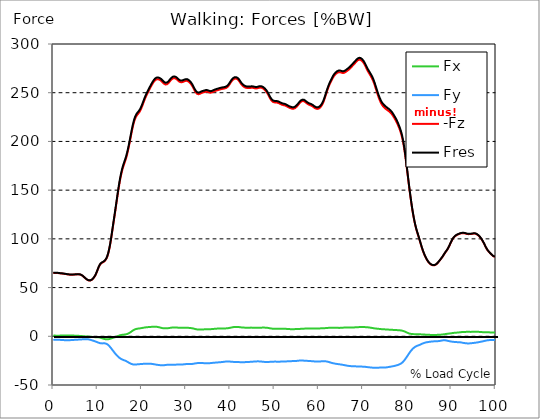
| Category |  Fx |  Fy |  -Fz |  Fres |
|---|---|---|---|---|
| 0.0 | 0.76 | -3.715 | 64.963 | 65.139 |
| 0.167348456675344 | 0.739 | -3.688 | 64.967 | 65.143 |
| 0.334696913350688 | 0.708 | -3.651 | 64.984 | 65.158 |
| 0.5020453700260321 | 0.669 | -3.611 | 65.007 | 65.179 |
| 0.669393826701376 | 0.629 | -3.578 | 65.024 | 65.193 |
| 0.83674228337672 | 0.603 | -3.56 | 65.014 | 65.181 |
| 1.0040907400520642 | 0.601 | -3.561 | 64.956 | 65.124 |
| 1.1621420602454444 | 0.618 | -3.583 | 64.855 | 65.022 |
| 1.3294905169207885 | 0.652 | -3.622 | 64.737 | 64.905 |
| 1.4968389735961325 | 0.694 | -3.671 | 64.634 | 64.803 |
| 1.6641874302714765 | 0.737 | -3.722 | 64.552 | 64.724 |
| 1.8315358869468206 | 0.779 | -3.774 | 64.482 | 64.657 |
| 1.9988843436221646 | 0.82 | -3.825 | 64.409 | 64.586 |
| 2.1662328002975086 | 0.855 | -3.876 | 64.316 | 64.495 |
| 2.333581256972853 | 0.882 | -3.926 | 64.202 | 64.384 |
| 2.5009297136481967 | 0.898 | -3.969 | 64.082 | 64.267 |
| 2.6682781703235405 | 0.9 | -4.001 | 63.967 | 64.154 |
| 2.8356266269988843 | 0.896 | -4.022 | 63.852 | 64.039 |
| 3.002975083674229 | 0.892 | -4.033 | 63.725 | 63.914 |
| 3.1703235403495724 | 0.886 | -4.037 | 63.592 | 63.781 |
| 3.337671997024917 | 0.88 | -4.033 | 63.463 | 63.651 |
| 3.4957233172182973 | 0.864 | -4.02 | 63.354 | 63.543 |
| 3.663071773893641 | 0.838 | -3.994 | 63.284 | 63.473 |
| 3.8304202305689854 | 0.804 | -3.957 | 63.255 | 63.442 |
| 3.997768687244329 | 0.769 | -3.91 | 63.254 | 63.439 |
| 4.165117143919673 | 0.739 | -3.857 | 63.264 | 63.448 |
| 4.332465600595017 | 0.716 | -3.804 | 63.272 | 63.453 |
| 4.499814057270361 | 0.698 | -3.752 | 63.279 | 63.458 |
| 4.667162513945706 | 0.681 | -3.701 | 63.301 | 63.477 |
| 4.834510970621049 | 0.664 | -3.65 | 63.352 | 63.526 |
| 5.001859427296393 | 0.644 | -3.6 | 63.429 | 63.602 |
| 5.169207883971737 | 0.622 | -3.553 | 63.512 | 63.683 |
| 5.336556340647081 | 0.592 | -3.508 | 63.569 | 63.737 |
| 5.503904797322425 | 0.548 | -3.464 | 63.591 | 63.757 |
| 5.671253253997769 | 0.491 | -3.416 | 63.582 | 63.745 |
| 5.82930457419115 | 0.419 | -3.363 | 63.539 | 63.696 |
| 5.996653030866494 | 0.345 | -3.306 | 63.433 | 63.586 |
| 6.164001487541838 | 0.276 | -3.254 | 63.227 | 63.374 |
| 6.331349944217181 | 0.215 | -3.208 | 62.892 | 63.036 |
| 6.498698400892526 | 0.161 | -3.165 | 62.428 | 62.567 |
| 6.66604685756787 | 0.107 | -3.118 | 61.852 | 61.987 |
| 6.833395314243213 | 0.051 | -3.068 | 61.193 | 61.325 |
| 7.000743770918558 | -0.011 | -3.018 | 60.495 | 60.624 |
| 7.168092227593902 | -0.079 | -2.974 | 59.798 | 59.925 |
| 7.335440684269246 | -0.15 | -2.947 | 59.145 | 59.27 |
| 7.50278914094459 | -0.218 | -2.945 | 58.556 | 58.681 |
| 7.6701375976199335 | -0.278 | -2.98 | 58.045 | 58.172 |
| 7.837486054295278 | -0.327 | -3.055 | 57.623 | 57.753 |
| 7.995537374488658 | -0.363 | -3.176 | 57.32 | 57.457 |
| 8.162885831164003 | -0.394 | -3.347 | 57.177 | 57.324 |
| 8.330234287839346 | -0.43 | -3.563 | 57.221 | 57.382 |
| 8.49758274451469 | -0.476 | -3.802 | 57.458 | 57.634 |
| 8.664931201190035 | -0.541 | -4.044 | 57.887 | 58.08 |
| 8.832279657865378 | -0.62 | -4.278 | 58.502 | 58.71 |
| 8.999628114540721 | -0.711 | -4.514 | 59.28 | 59.505 |
| 9.166976571216066 | -0.803 | -4.762 | 60.211 | 60.454 |
| 9.334325027891412 | -0.886 | -5.025 | 61.325 | 61.588 |
| 9.501673484566755 | -0.952 | -5.299 | 62.668 | 62.95 |
| 9.669021941242098 | -0.998 | -5.582 | 64.264 | 64.565 |
| 9.836370397917442 | -1.026 | -5.878 | 66.086 | 66.407 |
| 10.003718854592787 | -1.044 | -6.185 | 68.047 | 68.387 |
| 10.17106731126813 | -1.073 | -6.494 | 69.998 | 70.358 |
| 10.329118631461512 | -1.143 | -6.771 | 71.741 | 72.122 |
| 10.496467088136853 | -1.273 | -7.007 | 73.177 | 73.576 |
| 10.663815544812199 | -1.461 | -7.179 | 74.252 | 74.664 |
| 10.831164001487544 | -1.704 | -7.281 | 74.999 | 75.423 |
| 10.998512458162887 | -1.982 | -7.306 | 75.508 | 75.935 |
| 11.16586091483823 | -2.259 | -7.273 | 75.895 | 76.319 |
| 11.333209371513574 | -2.51 | -7.216 | 76.27 | 76.691 |
| 11.50055782818892 | -2.722 | -7.208 | 76.766 | 77.189 |
| 11.667906284864264 | -2.893 | -7.276 | 77.494 | 77.926 |
| 11.835254741539607 | -3.023 | -7.434 | 78.472 | 78.921 |
| 12.00260319821495 | -3.109 | -7.712 | 79.771 | 80.245 |
| 12.169951654890292 | -3.129 | -8.124 | 81.543 | 82.053 |
| 12.337300111565641 | -3.085 | -8.666 | 83.818 | 84.372 |
| 12.504648568240984 | -2.973 | -9.343 | 86.647 | 87.255 |
| 12.662699888434362 | -2.796 | -10.135 | 90.039 | 90.709 |
| 12.830048345109708 | -2.562 | -11.012 | 93.986 | 94.722 |
| 12.997396801785053 | -2.299 | -11.948 | 98.429 | 99.239 |
| 13.164745258460396 | -2.03 | -12.92 | 103.283 | 104.166 |
| 13.33209371513574 | -1.772 | -13.909 | 108.391 | 109.351 |
| 13.499442171811083 | -1.534 | -14.901 | 113.506 | 114.543 |
| 13.666790628486426 | -1.314 | -15.887 | 118.505 | 119.619 |
| 13.834139085161771 | -1.099 | -16.854 | 123.466 | 124.657 |
| 14.001487541837117 | -0.863 | -17.789 | 128.532 | 129.795 |
| 14.16883599851246 | -0.594 | -18.684 | 133.724 | 135.055 |
| 14.336184455187803 | -0.293 | -19.527 | 138.971 | 140.361 |
| 14.503532911863147 | 0.03 | -20.314 | 144.156 | 145.602 |
| 14.670881368538492 | 0.349 | -21.043 | 149.16 | 150.657 |
| 14.828932688731873 | 0.652 | -21.709 | 153.906 | 155.447 |
| 14.996281145407215 | 0.926 | -22.309 | 158.341 | 159.924 |
| 15.163629602082558 | 1.16 | -22.842 | 162.388 | 164.004 |
| 15.330978058757903 | 1.348 | -23.314 | 166.021 | 167.666 |
| 15.498326515433247 | 1.495 | -23.722 | 169.247 | 170.917 |
| 15.665674972108594 | 1.601 | -24.06 | 172.089 | 173.778 |
| 15.833023428783937 | 1.678 | -24.342 | 174.607 | 176.311 |
| 16.00037188545928 | 1.739 | -24.607 | 176.84 | 178.561 |
| 16.167720342134626 | 1.811 | -24.881 | 178.936 | 180.676 |
| 16.335068798809967 | 1.922 | -25.2 | 181.167 | 182.93 |
| 16.502417255485312 | 2.09 | -25.568 | 183.691 | 185.483 |
| 16.669765712160658 | 2.318 | -25.981 | 186.585 | 188.409 |
| 16.837114168836 | 2.614 | -26.429 | 189.798 | 191.659 |
| 17.004462625511344 | 2.98 | -26.882 | 193.27 | 195.166 |
| 17.16251394570472 | 3.403 | -27.322 | 196.942 | 198.871 |
| 17.32986240238007 | 3.869 | -27.737 | 200.768 | 202.727 |
| 17.497210859055414 | 4.37 | -28.111 | 204.696 | 206.679 |
| 17.664559315730756 | 4.905 | -28.431 | 208.598 | 210.602 |
| 17.8319077724061 | 5.445 | -28.678 | 212.325 | 214.339 |
| 17.999256229081443 | 5.963 | -28.848 | 215.751 | 217.77 |
| 18.166604685756788 | 6.442 | -28.942 | 218.778 | 220.794 |
| 18.333953142432133 | 6.861 | -28.974 | 221.354 | 223.363 |
| 18.501301599107478 | 7.2 | -28.962 | 223.453 | 225.45 |
| 18.668650055782823 | 7.461 | -28.926 | 225.132 | 227.118 |
| 18.835998512458165 | 7.655 | -28.868 | 226.448 | 228.42 |
| 19.00334696913351 | 7.796 | -28.793 | 227.488 | 229.447 |
| 19.170695425808855 | 7.902 | -28.722 | 228.404 | 230.349 |
| 19.338043882484197 | 7.996 | -28.654 | 229.351 | 231.282 |
| 19.496095202677576 | 8.096 | -28.586 | 230.484 | 232.401 |
| 19.66344365935292 | 8.207 | -28.526 | 231.834 | 233.735 |
| 19.830792116028263 | 8.334 | -28.468 | 233.438 | 235.324 |
| 19.998140572703612 | 8.471 | -28.406 | 235.257 | 237.126 |
| 20.165489029378953 | 8.615 | -28.349 | 237.228 | 239.079 |
| 20.3328374860543 | 8.76 | -28.302 | 239.274 | 241.11 |
| 20.500185942729644 | 8.899 | -28.264 | 241.309 | 243.13 |
| 20.667534399404985 | 9.027 | -28.23 | 243.257 | 245.064 |
| 20.83488285608033 | 9.141 | -28.197 | 245.089 | 246.884 |
| 21.002231312755672 | 9.235 | -28.163 | 246.802 | 248.584 |
| 21.16957976943102 | 9.311 | -28.131 | 248.4 | 250.168 |
| 21.336928226106362 | 9.375 | -28.111 | 249.941 | 251.7 |
| 21.504276682781704 | 9.437 | -28.109 | 251.461 | 253.211 |
| 21.67162513945705 | 9.498 | -28.129 | 252.945 | 254.688 |
| 21.82967645965043 | 9.56 | -28.168 | 254.391 | 256.132 |
| 21.997024916325774 | 9.619 | -28.215 | 255.811 | 257.549 |
| 22.16437337300112 | 9.674 | -28.28 | 257.196 | 258.935 |
| 22.33172182967646 | 9.722 | -28.367 | 258.536 | 260.278 |
| 22.499070286351806 | 9.761 | -28.48 | 259.811 | 261.558 |
| 22.666418743027148 | 9.793 | -28.614 | 260.974 | 262.729 |
| 22.833767199702496 | 9.816 | -28.76 | 261.982 | 263.747 |
| 23.00111565637784 | 9.822 | -28.903 | 262.789 | 264.565 |
| 23.168464113053183 | 9.801 | -29.033 | 263.353 | 265.138 |
| 23.335812569728528 | 9.741 | -29.158 | 263.692 | 265.486 |
| 23.50316102640387 | 9.64 | -29.283 | 263.84 | 265.642 |
| 23.670509483079215 | 9.504 | -29.396 | 263.82 | 265.63 |
| 23.83785793975456 | 9.339 | -29.494 | 263.651 | 265.466 |
| 23.995909259947936 | 9.149 | -29.58 | 263.352 | 265.172 |
| 24.163257716623285 | 8.945 | -29.657 | 262.934 | 264.759 |
| 24.330606173298627 | 8.734 | -29.722 | 262.394 | 264.223 |
| 24.49795462997397 | 8.544 | -29.763 | 261.705 | 263.538 |
| 24.665303086649313 | 8.381 | -29.774 | 260.898 | 262.732 |
| 24.83265154332466 | 8.254 | -29.748 | 260.073 | 261.908 |
| 25.0 | 8.17 | -29.689 | 259.361 | 261.19 |
| 25.167348456675345 | 8.129 | -29.603 | 258.813 | 260.636 |
| 25.334696913350694 | 8.124 | -29.5 | 258.483 | 260.296 |
| 25.502045370026035 | 8.143 | -29.395 | 258.411 | 260.213 |
| 25.669393826701377 | 8.188 | -29.295 | 258.612 | 260.402 |
| 25.836742283376722 | 8.258 | -29.214 | 259.081 | 260.862 |
| 26.004090740052067 | 8.351 | -29.157 | 259.794 | 261.566 |
| 26.17143919672741 | 8.466 | -29.122 | 260.688 | 262.453 |
| 26.329490516920792 | 8.596 | -29.106 | 261.663 | 263.424 |
| 26.49683897359613 | 8.726 | -29.097 | 262.597 | 264.355 |
| 26.66418743027148 | 8.848 | -29.096 | 263.429 | 265.186 |
| 26.831535886946828 | 8.956 | -29.1 | 264.12 | 265.875 |
| 26.998884343622166 | 9.045 | -29.107 | 264.63 | 266.387 |
| 27.166232800297514 | 9.101 | -29.112 | 264.921 | 266.678 |
| 27.333581256972852 | 9.122 | -29.112 | 264.984 | 266.741 |
| 27.5009297136482 | 9.109 | -29.108 | 264.835 | 266.593 |
| 27.668278170323543 | 9.071 | -29.099 | 264.504 | 266.263 |
| 27.835626626998888 | 9.012 | -29.086 | 264.012 | 265.771 |
| 28.002975083674233 | 8.933 | -29.068 | 263.36 | 265.118 |
| 28.170323540349575 | 8.843 | -29.045 | 262.598 | 264.357 |
| 28.33767199702492 | 8.759 | -29.02 | 261.859 | 263.618 |
| 28.50502045370026 | 8.699 | -28.999 | 261.291 | 263.049 |
| 28.663071773893645 | 8.669 | -28.982 | 260.921 | 262.68 |
| 28.830420230568986 | 8.664 | -28.964 | 260.743 | 262.503 |
| 28.99776868724433 | 8.671 | -28.942 | 260.735 | 262.493 |
| 29.165117143919673 | 8.689 | -28.911 | 260.875 | 262.63 |
| 29.33246560059502 | 8.719 | -28.868 | 261.146 | 262.896 |
| 29.499814057270367 | 8.762 | -28.797 | 261.5 | 263.242 |
| 29.66716251394571 | 8.794 | -28.701 | 261.845 | 263.575 |
| 29.834510970621054 | 8.803 | -28.603 | 262.116 | 263.834 |
| 30.00185942729639 | 8.789 | -28.515 | 262.247 | 263.955 |
| 30.169207883971744 | 8.759 | -28.443 | 262.23 | 263.928 |
| 30.33655634064708 | 8.717 | -28.393 | 262.047 | 263.739 |
| 30.50390479732243 | 8.665 | -28.373 | 261.658 | 263.347 |
| 30.671253253997772 | 8.607 | -28.383 | 261.098 | 262.791 |
| 30.829304574191156 | 8.547 | -28.409 | 260.406 | 262.103 |
| 30.996653030866494 | 8.483 | -28.433 | 259.599 | 261.302 |
| 31.164001487541842 | 8.402 | -28.439 | 258.642 | 260.347 |
| 31.331349944217187 | 8.289 | -28.402 | 257.473 | 259.179 |
| 31.498698400892525 | 8.144 | -28.328 | 256.134 | 257.835 |
| 31.666046857567874 | 7.969 | -28.214 | 254.675 | 256.368 |
| 31.833395314243212 | 7.771 | -28.069 | 253.167 | 254.848 |
| 32.00074377091856 | 7.56 | -27.911 | 251.766 | 253.433 |
| 32.1680922275939 | 7.355 | -27.764 | 250.563 | 252.215 |
| 32.33544068426925 | 7.172 | -27.643 | 249.599 | 251.24 |
| 32.50278914094459 | 7.019 | -27.548 | 248.898 | 250.527 |
| 32.670137597619934 | 6.912 | -27.475 | 248.511 | 250.133 |
| 32.83748605429528 | 6.852 | -27.428 | 248.443 | 250.059 |
| 33.004834510970625 | 6.834 | -27.409 | 248.632 | 250.243 |
| 33.162885831164004 | 6.853 | -27.411 | 248.987 | 250.597 |
| 33.33023428783935 | 6.893 | -27.433 | 249.401 | 251.011 |
| 33.497582744514695 | 6.937 | -27.469 | 249.76 | 251.372 |
| 33.664931201190036 | 6.983 | -27.506 | 250.042 | 251.657 |
| 33.83227965786538 | 7.029 | -27.535 | 250.253 | 251.869 |
| 33.99962811454073 | 7.078 | -27.561 | 250.439 | 252.058 |
| 34.16697657121607 | 7.128 | -27.597 | 250.667 | 252.289 |
| 34.33432502789141 | 7.176 | -27.637 | 250.919 | 252.543 |
| 34.50167348456676 | 7.214 | -27.682 | 251.102 | 252.731 |
| 34.6690219412421 | 7.242 | -27.726 | 251.139 | 252.773 |
| 34.83637039791744 | 7.261 | -27.752 | 251.011 | 252.648 |
| 35.00371885459279 | 7.27 | -27.743 | 250.742 | 252.38 |
| 35.17106731126814 | 7.275 | -27.695 | 250.392 | 252.028 |
| 35.338415767943474 | 7.283 | -27.621 | 250.091 | 251.72 |
| 35.49646708813686 | 7.303 | -27.532 | 249.962 | 251.583 |
| 35.6638155448122 | 7.341 | -27.443 | 250.027 | 251.638 |
| 35.831164001487544 | 7.393 | -27.356 | 250.26 | 251.863 |
| 35.998512458162885 | 7.46 | -27.278 | 250.598 | 252.192 |
| 36.165860914838234 | 7.535 | -27.199 | 250.964 | 252.548 |
| 36.333209371513576 | 7.61 | -27.129 | 251.324 | 252.902 |
| 36.50055782818892 | 7.681 | -27.073 | 251.654 | 253.227 |
| 36.667906284864266 | 7.747 | -27.022 | 251.939 | 253.506 |
| 36.83525474153961 | 7.808 | -26.97 | 252.185 | 253.746 |
| 37.002603198214956 | 7.861 | -26.905 | 252.411 | 253.967 |
| 37.1699516548903 | 7.905 | -26.83 | 252.636 | 254.183 |
| 37.337300111565646 | 7.939 | -26.749 | 252.873 | 254.412 |
| 37.50464856824098 | 7.971 | -26.68 | 253.122 | 254.653 |
| 37.66269988843437 | 8.004 | -26.624 | 253.353 | 254.878 |
| 37.83004834510971 | 8.04 | -26.566 | 253.555 | 255.073 |
| 37.99739680178505 | 8.072 | -26.501 | 253.729 | 255.241 |
| 38.16474525846039 | 8.095 | -26.424 | 253.89 | 255.395 |
| 38.33209371513574 | 8.104 | -26.336 | 254.041 | 255.536 |
| 38.49944217181109 | 8.099 | -26.229 | 254.171 | 255.653 |
| 38.666790628486424 | 8.089 | -26.12 | 254.297 | 255.768 |
| 38.83413908516178 | 8.085 | -26.018 | 254.472 | 255.931 |
| 39.001487541837115 | 8.101 | -25.94 | 254.751 | 256.203 |
| 39.16883599851246 | 8.143 | -25.895 | 255.159 | 256.605 |
| 39.336184455187805 | 8.216 | -25.878 | 255.725 | 257.169 |
| 39.503532911863154 | 8.32 | -25.883 | 256.481 | 257.924 |
| 39.670881368538495 | 8.447 | -25.905 | 257.43 | 258.874 |
| 39.83822982521384 | 8.589 | -25.945 | 258.541 | 259.987 |
| 39.996281145407224 | 8.748 | -26 | 259.734 | 261.186 |
| 40.163629602082565 | 8.913 | -26.064 | 260.913 | 262.369 |
| 40.33097805875791 | 9.081 | -26.134 | 261.972 | 263.435 |
| 40.498326515433256 | 9.241 | -26.203 | 262.86 | 264.33 |
| 40.6656749721086 | 9.38 | -26.265 | 263.565 | 265.042 |
| 40.83302342878393 | 9.494 | -26.315 | 264.091 | 265.573 |
| 41.00037188545929 | 9.578 | -26.355 | 264.432 | 265.92 |
| 41.16772034213463 | 9.631 | -26.389 | 264.566 | 266.059 |
| 41.33506879880997 | 9.65 | -26.419 | 264.483 | 265.979 |
| 41.50241725548531 | 9.632 | -26.445 | 264.186 | 265.685 |
| 41.66976571216066 | 9.584 | -26.469 | 263.672 | 265.176 |
| 41.837114168836 | 9.514 | -26.492 | 262.95 | 264.457 |
| 42.004462625511344 | 9.426 | -26.514 | 262.03 | 263.542 |
| 42.17181108218669 | 9.325 | -26.533 | 260.933 | 262.45 |
| 42.32986240238007 | 9.221 | -26.55 | 259.744 | 261.265 |
| 42.497210859055414 | 9.124 | -26.562 | 258.648 | 260.174 |
| 42.66455931573076 | 9.042 | -26.574 | 257.727 | 259.257 |
| 42.831907772406105 | 8.978 | -26.58 | 256.975 | 258.507 |
| 42.999256229081446 | 8.93 | -26.574 | 256.355 | 257.888 |
| 43.16660468575679 | 8.891 | -26.554 | 255.828 | 257.362 |
| 43.33395314243214 | 8.862 | -26.526 | 255.415 | 256.946 |
| 43.50130159910748 | 8.843 | -26.493 | 255.118 | 256.646 |
| 43.66865005578282 | 8.835 | -26.455 | 254.929 | 256.453 |
| 43.83599851245817 | 8.839 | -26.413 | 254.831 | 256.352 |
| 44.00334696913351 | 8.845 | -26.369 | 254.782 | 256.3 |
| 44.17069542580886 | 8.854 | -26.328 | 254.771 | 256.285 |
| 44.3380438824842 | 8.87 | -26.286 | 254.81 | 256.318 |
| 44.49609520267758 | 8.883 | -26.243 | 254.892 | 256.396 |
| 44.66344365935292 | 8.891 | -26.193 | 254.999 | 256.499 |
| 44.83079211602827 | 8.89 | -26.136 | 255.075 | 256.567 |
| 44.99814057270361 | 8.878 | -26.076 | 255.055 | 256.542 |
| 45.16548902937895 | 8.86 | -26.017 | 254.956 | 256.437 |
| 45.332837486054295 | 8.839 | -25.958 | 254.791 | 256.266 |
| 45.500185942729644 | 8.817 | -25.901 | 254.598 | 256.068 |
| 45.66753439940499 | 8.797 | -25.848 | 254.447 | 255.91 |
| 45.83488285608033 | 8.781 | -25.799 | 254.39 | 255.849 |
| 46.00223131275568 | 8.768 | -25.757 | 254.439 | 255.894 |
| 46.16957976943102 | 8.759 | -25.729 | 254.592 | 256.042 |
| 46.336928226106366 | 8.757 | -25.725 | 254.829 | 256.278 |
| 46.50427668278171 | 8.765 | -25.751 | 255.07 | 256.522 |
| 46.671625139457056 | 8.787 | -25.798 | 255.238 | 256.694 |
| 46.829676459650436 | 8.821 | -25.863 | 255.283 | 256.747 |
| 46.99702491632577 | 8.859 | -25.937 | 255.196 | 256.669 |
| 47.16437337300112 | 8.895 | -26.016 | 254.97 | 256.453 |
| 47.33172182967646 | 8.919 | -26.098 | 254.602 | 256.096 |
| 47.49907028635181 | 8.925 | -26.177 | 254.103 | 255.609 |
| 47.66641874302716 | 8.913 | -26.252 | 253.489 | 255.005 |
| 47.83376719970249 | 8.893 | -26.324 | 252.775 | 254.304 |
| 48.001115656377834 | 8.857 | -26.383 | 251.94 | 253.478 |
| 48.16846411305319 | 8.802 | -26.418 | 250.966 | 252.512 |
| 48.33581256972853 | 8.726 | -26.424 | 249.848 | 251.399 |
| 48.50316102640387 | 8.62 | -26.403 | 248.586 | 250.14 |
| 48.67050948307921 | 8.491 | -26.357 | 247.202 | 248.755 |
| 48.837857939754564 | 8.343 | -26.285 | 245.714 | 247.263 |
| 49.005206396429905 | 8.191 | -26.206 | 244.237 | 245.782 |
| 49.163257716623285 | 8.051 | -26.141 | 242.942 | 244.483 |
| 49.33060617329863 | 7.928 | -26.094 | 241.884 | 243.423 |
| 49.49795462997397 | 7.832 | -26.063 | 241.088 | 242.626 |
| 49.66530308664932 | 7.766 | -26.039 | 240.535 | 242.072 |
| 49.832651543324666 | 7.731 | -26.019 | 240.216 | 241.753 |
| 50.0 | 7.717 | -26.008 | 240.078 | 241.613 |
| 50.16734845667534 | 7.721 | -26.006 | 240.034 | 241.57 |
| 50.33469691335069 | 7.734 | -26.011 | 239.999 | 241.537 |
| 50.50204537002604 | 7.752 | -26.024 | 239.911 | 241.454 |
| 50.66939382670139 | 7.766 | -26.041 | 239.766 | 241.311 |
| 50.836742283376715 | 7.771 | -26.051 | 239.546 | 241.094 |
| 51.00409074005207 | 7.757 | -26.048 | 239.225 | 240.775 |
| 51.17143919672741 | 7.735 | -26.032 | 238.818 | 240.367 |
| 51.32949051692079 | 7.715 | -26.009 | 238.392 | 239.941 |
| 51.496838973596134 | 7.711 | -25.984 | 238.023 | 239.572 |
| 51.66418743027148 | 7.717 | -25.962 | 237.716 | 239.264 |
| 51.831535886946824 | 7.731 | -25.943 | 237.469 | 239.018 |
| 51.99888434362217 | 7.734 | -25.918 | 237.276 | 238.825 |
| 52.16623280029752 | 7.713 | -25.871 | 237.14 | 238.684 |
| 52.33358125697285 | 7.678 | -25.82 | 236.98 | 238.517 |
| 52.5009297136482 | 7.645 | -25.789 | 236.694 | 238.23 |
| 52.668278170323546 | 7.611 | -25.77 | 236.3 | 237.836 |
| 52.835626626998895 | 7.569 | -25.75 | 235.858 | 237.393 |
| 53.00297508367424 | 7.519 | -25.72 | 235.414 | 236.946 |
| 53.17032354034958 | 7.463 | -25.675 | 235.004 | 236.533 |
| 53.33767199702492 | 7.404 | -25.623 | 234.633 | 236.157 |
| 53.50502045370027 | 7.345 | -25.573 | 234.307 | 235.827 |
| 53.663071773893655 | 7.292 | -25.53 | 234.037 | 235.553 |
| 53.83042023056899 | 7.253 | -25.499 | 233.808 | 235.323 |
| 53.99776868724433 | 7.238 | -25.486 | 233.614 | 235.128 |
| 54.16511714391967 | 7.247 | -25.48 | 233.512 | 235.026 |
| 54.33246560059503 | 7.274 | -25.47 | 233.589 | 235.102 |
| 54.49981405727037 | 7.321 | -25.445 | 233.853 | 235.364 |
| 54.667162513945705 | 7.38 | -25.405 | 234.288 | 235.795 |
| 54.834510970621054 | 7.442 | -25.35 | 234.866 | 236.368 |
| 55.0018594272964 | 7.501 | -25.278 | 235.578 | 237.07 |
| 55.169207883971744 | 7.547 | -25.189 | 236.414 | 237.896 |
| 55.336556340647086 | 7.567 | -25.091 | 237.353 | 238.822 |
| 55.50390479732243 | 7.571 | -24.999 | 238.33 | 239.786 |
| 55.671253253997776 | 7.578 | -24.926 | 239.27 | 240.715 |
| 55.83860171067312 | 7.596 | -24.882 | 240.099 | 241.536 |
| 55.9966530308665 | 7.628 | -24.87 | 240.762 | 242.197 |
| 56.16400148754184 | 7.662 | -24.878 | 241.229 | 242.664 |
| 56.33134994421718 | 7.704 | -24.906 | 241.466 | 242.903 |
| 56.498698400892536 | 7.757 | -24.952 | 241.478 | 242.921 |
| 56.66604685756788 | 7.82 | -25.004 | 241.276 | 242.727 |
| 56.83339531424321 | 7.886 | -25.052 | 240.881 | 242.34 |
| 57.00074377091856 | 7.945 | -25.101 | 240.316 | 241.783 |
| 57.16809222759391 | 7.987 | -25.152 | 239.647 | 241.125 |
| 57.33544068426925 | 8.022 | -25.207 | 238.981 | 240.468 |
| 57.5027891409446 | 8.06 | -25.261 | 238.416 | 239.912 |
| 57.670137597619934 | 8.086 | -25.306 | 237.977 | 239.48 |
| 57.83748605429528 | 8.102 | -25.346 | 237.627 | 239.136 |
| 58.004834510970625 | 8.106 | -25.388 | 237.325 | 238.841 |
| 58.16288583116401 | 8.103 | -25.442 | 237.042 | 238.563 |
| 58.330234287839346 | 8.094 | -25.506 | 236.729 | 238.259 |
| 58.497582744514695 | 8.088 | -25.575 | 236.327 | 237.866 |
| 58.66493120119004 | 8.078 | -25.645 | 235.826 | 237.374 |
| 58.832279657865385 | 8.063 | -25.712 | 235.248 | 236.807 |
| 58.999628114540734 | 8.044 | -25.772 | 234.653 | 236.219 |
| 59.16697657121607 | 8.034 | -25.822 | 234.133 | 235.707 |
| 59.33432502789142 | 8.035 | -25.86 | 233.727 | 235.309 |
| 59.50167348456676 | 8.043 | -25.881 | 233.465 | 235.05 |
| 59.66902194124211 | 8.05 | -25.894 | 233.367 | 234.955 |
| 59.83637039791745 | 8.058 | -25.894 | 233.442 | 235.028 |
| 60.00371885459278 | 8.071 | -25.88 | 233.705 | 235.29 |
| 60.17106731126813 | 8.09 | -25.852 | 234.168 | 235.748 |
| 60.33841576794349 | 8.113 | -25.809 | 234.829 | 236.401 |
| 60.49646708813685 | 8.141 | -25.753 | 235.706 | 237.268 |
| 60.6638155448122 | 8.172 | -25.691 | 236.816 | 238.366 |
| 60.831164001487544 | 8.209 | -25.637 | 238.165 | 239.703 |
| 60.99851245816289 | 8.252 | -25.6 | 239.781 | 241.306 |
| 61.16586091483824 | 8.295 | -25.587 | 241.668 | 243.181 |
| 61.333209371513576 | 8.334 | -25.604 | 243.806 | 245.311 |
| 61.50055782818892 | 8.378 | -25.659 | 246.147 | 247.644 |
| 61.667906284864266 | 8.439 | -25.755 | 248.601 | 250.094 |
| 61.835254741539615 | 8.51 | -25.888 | 250.981 | 252.476 |
| 62.002603198214956 | 8.58 | -26.057 | 253.176 | 254.678 |
| 62.16995165489029 | 8.636 | -26.246 | 255.276 | 256.789 |
| 62.33730011156564 | 8.678 | -26.458 | 257.227 | 258.75 |
| 62.504648568240995 | 8.705 | -26.696 | 258.965 | 260.504 |
| 62.67199702491633 | 8.721 | -26.942 | 260.548 | 262.104 |
| 62.83004834510971 | 8.725 | -27.18 | 262.064 | 263.635 |
| 62.99739680178505 | 8.712 | -27.394 | 263.596 | 265.18 |
| 63.1647452584604 | 8.705 | -27.581 | 265.066 | 266.659 |
| 63.33209371513575 | 8.707 | -27.753 | 266.348 | 267.951 |
| 63.4994421718111 | 8.708 | -27.91 | 267.448 | 269.061 |
| 63.666790628486424 | 8.702 | -28.054 | 268.387 | 270.009 |
| 63.83413908516177 | 8.691 | -28.187 | 269.188 | 270.82 |
| 64.00148754183712 | 8.673 | -28.307 | 269.859 | 271.499 |
| 64.16883599851248 | 8.656 | -28.416 | 270.4 | 272.048 |
| 64.3361844551878 | 8.64 | -28.519 | 270.806 | 272.462 |
| 64.50353291186315 | 8.628 | -28.62 | 271.056 | 272.721 |
| 64.6708813685385 | 8.623 | -28.727 | 271.136 | 272.812 |
| 64.83822982521384 | 8.633 | -28.84 | 271.053 | 272.743 |
| 65.00557828188919 | 8.668 | -28.957 | 270.83 | 272.537 |
| 65.16362960208257 | 8.731 | -29.086 | 270.541 | 272.267 |
| 65.3309780587579 | 8.801 | -29.221 | 270.308 | 272.054 |
| 65.49832651543326 | 8.861 | -29.357 | 270.23 | 271.998 |
| 65.6656749721086 | 8.911 | -29.499 | 270.331 | 272.116 |
| 65.83302342878395 | 8.95 | -29.647 | 270.603 | 272.406 |
| 66.00037188545929 | 8.981 | -29.797 | 271.016 | 272.834 |
| 66.16772034213463 | 9.007 | -29.943 | 271.559 | 273.392 |
| 66.33506879880998 | 9.025 | -30.082 | 272.157 | 274.002 |
| 66.50241725548531 | 9.036 | -30.215 | 272.73 | 274.586 |
| 66.66976571216065 | 9.05 | -30.335 | 273.278 | 275.145 |
| 66.83711416883601 | 9.061 | -30.441 | 273.869 | 275.743 |
| 67.00446262551135 | 9.058 | -30.527 | 274.546 | 276.425 |
| 67.1718110821867 | 9.049 | -30.602 | 275.301 | 277.183 |
| 67.32986240238007 | 9.047 | -30.667 | 276.103 | 277.988 |
| 67.49721085905541 | 9.061 | -30.724 | 276.927 | 278.813 |
| 67.66455931573076 | 9.078 | -30.752 | 277.754 | 279.638 |
| 67.83190777240611 | 9.097 | -30.772 | 278.572 | 280.453 |
| 67.99925622908145 | 9.119 | -30.799 | 279.368 | 281.249 |
| 68.16660468575678 | 9.146 | -30.829 | 280.181 | 282.06 |
| 68.33395314243214 | 9.188 | -30.864 | 281.049 | 282.929 |
| 68.50130159910749 | 9.238 | -30.898 | 281.91 | 283.791 |
| 68.66865005578282 | 9.291 | -30.927 | 282.687 | 284.567 |
| 68.83599851245816 | 9.342 | -30.954 | 283.315 | 285.197 |
| 69.00334696913352 | 9.386 | -30.975 | 283.74 | 285.623 |
| 69.17069542580886 | 9.42 | -30.994 | 283.935 | 285.82 |
| 69.3380438824842 | 9.455 | -31.017 | 283.897 | 285.787 |
| 69.50539233915956 | 9.479 | -31.047 | 283.625 | 285.522 |
| 69.66344365935292 | 9.493 | -31.089 | 283.125 | 285.032 |
| 69.83079211602826 | 9.49 | -31.134 | 282.445 | 284.362 |
| 69.99814057270362 | 9.478 | -31.18 | 281.58 | 283.509 |
| 70.16548902937896 | 9.459 | -31.23 | 280.502 | 282.445 |
| 70.33283748605429 | 9.438 | -31.283 | 279.235 | 281.194 |
| 70.50018594272964 | 9.409 | -31.346 | 277.811 | 279.785 |
| 70.667534399405 | 9.372 | -31.426 | 276.249 | 278.245 |
| 70.83488285608033 | 9.329 | -31.528 | 274.612 | 276.629 |
| 71.00223131275568 | 9.274 | -31.633 | 273.065 | 275.104 |
| 71.16957976943102 | 9.193 | -31.723 | 271.664 | 273.721 |
| 71.33692822610637 | 9.083 | -31.802 | 270.408 | 272.479 |
| 71.50427668278171 | 8.967 | -31.889 | 269.163 | 271.251 |
| 71.67162513945706 | 8.851 | -31.984 | 267.875 | 269.98 |
| 71.8389735961324 | 8.734 | -32.075 | 266.534 | 268.658 |
| 71.99702491632577 | 8.614 | -32.145 | 265.128 | 267.27 |
| 72.16437337300113 | 8.475 | -32.191 | 263.599 | 265.755 |
| 72.33172182967647 | 8.33 | -32.212 | 261.845 | 264.016 |
| 72.49907028635181 | 8.193 | -32.216 | 259.855 | 262.04 |
| 72.66641874302715 | 8.073 | -32.208 | 257.642 | 259.843 |
| 72.8337671997025 | 7.982 | -32.208 | 255.281 | 257.5 |
| 73.00111565637783 | 7.905 | -32.207 | 252.861 | 255.1 |
| 73.16846411305319 | 7.827 | -32.197 | 250.433 | 252.69 |
| 73.33581256972853 | 7.747 | -32.184 | 248.065 | 250.341 |
| 73.50316102640387 | 7.664 | -32.174 | 245.838 | 248.131 |
| 73.67050948307921 | 7.577 | -32.17 | 243.785 | 246.094 |
| 73.83785793975457 | 7.486 | -32.166 | 241.907 | 244.232 |
| 74.00520639642991 | 7.399 | -32.166 | 240.208 | 242.546 |
| 74.16325771662328 | 7.327 | -32.166 | 238.711 | 241.064 |
| 74.33060617329863 | 7.27 | -32.168 | 237.446 | 239.809 |
| 74.49795462997398 | 7.222 | -32.165 | 236.411 | 238.782 |
| 74.66530308664932 | 7.176 | -32.147 | 235.54 | 237.917 |
| 74.83265154332466 | 7.132 | -32.11 | 234.77 | 237.147 |
| 75.00000000000001 | 7.09 | -32.052 | 234.057 | 236.431 |
| 75.16734845667534 | 7.054 | -31.984 | 233.376 | 235.746 |
| 75.3346969133507 | 7.012 | -31.9 | 232.748 | 235.111 |
| 75.50204537002605 | 6.952 | -31.789 | 232.206 | 234.558 |
| 75.66939382670138 | 6.885 | -31.655 | 231.69 | 234.028 |
| 75.83674228337672 | 6.832 | -31.518 | 231.135 | 233.458 |
| 76.00409074005208 | 6.789 | -31.387 | 230.511 | 232.821 |
| 76.17143919672742 | 6.752 | -31.266 | 229.85 | 232.15 |
| 76.33878765340276 | 6.71 | -31.142 | 229.089 | 231.377 |
| 76.49683897359614 | 6.659 | -31.002 | 228.185 | 230.46 |
| 76.66418743027148 | 6.605 | -30.852 | 227.146 | 229.411 |
| 76.83153588694682 | 6.56 | -30.701 | 225.975 | 228.228 |
| 76.99888434362218 | 6.519 | -30.537 | 224.755 | 226.997 |
| 77.16623280029752 | 6.478 | -30.361 | 223.501 | 225.732 |
| 77.33358125697285 | 6.435 | -30.172 | 222.185 | 224.4 |
| 77.5009297136482 | 6.391 | -29.969 | 220.783 | 222.983 |
| 77.66827817032356 | 6.345 | -29.753 | 219.269 | 221.45 |
| 77.83562662699889 | 6.298 | -29.518 | 217.641 | 219.804 |
| 78.00297508367423 | 6.254 | -29.253 | 215.888 | 218.03 |
| 78.17032354034959 | 6.203 | -28.957 | 214.006 | 216.125 |
| 78.33767199702493 | 6.137 | -28.626 | 211.979 | 214.07 |
| 78.50502045370027 | 6.044 | -28.249 | 209.771 | 211.829 |
| 78.67236891037561 | 5.924 | -27.802 | 207.298 | 209.315 |
| 78.83042023056899 | 5.774 | -27.245 | 204.432 | 206.399 |
| 78.99776868724433 | 5.59 | -26.54 | 201.024 | 202.924 |
| 79.16511714391969 | 5.364 | -25.707 | 197.004 | 198.828 |
| 79.33246560059503 | 5.098 | -24.781 | 192.419 | 194.157 |
| 79.49981405727036 | 4.798 | -23.784 | 187.332 | 188.98 |
| 79.66716251394571 | 4.46 | -22.732 | 181.781 | 183.334 |
| 79.83451097062107 | 4.094 | -21.637 | 175.857 | 177.312 |
| 80.00185942729641 | 3.714 | -20.5 | 169.645 | 170.998 |
| 80.16920788397174 | 3.353 | -19.353 | 163.355 | 164.607 |
| 80.33655634064709 | 3.042 | -18.222 | 157.156 | 158.309 |
| 80.50390479732243 | 2.797 | -17.129 | 151.191 | 152.252 |
| 80.67125325399778 | 2.615 | -16.062 | 145.446 | 146.418 |
| 80.83860171067312 | 2.483 | -15.047 | 139.937 | 140.827 |
| 80.99665303086651 | 2.384 | -14.102 | 134.689 | 135.504 |
| 81.16400148754184 | 2.305 | -13.253 | 129.786 | 130.536 |
| 81.3313499442172 | 2.238 | -12.499 | 125.262 | 125.956 |
| 81.49869840089255 | 2.187 | -11.828 | 121.105 | 121.75 |
| 81.66604685756786 | 2.153 | -11.239 | 117.316 | 117.92 |
| 81.83339531424322 | 2.132 | -10.726 | 113.9 | 114.469 |
| 82.00074377091858 | 2.123 | -10.296 | 110.863 | 111.404 |
| 82.16809222759392 | 2.126 | -9.947 | 108.167 | 108.686 |
| 82.33544068426926 | 2.136 | -9.659 | 105.698 | 106.201 |
| 82.50278914094459 | 2.137 | -9.396 | 103.312 | 103.803 |
| 82.67013759761994 | 2.111 | -9.118 | 100.863 | 101.339 |
| 82.83748605429528 | 2.063 | -8.809 | 98.328 | 98.786 |
| 83.00483451097062 | 2.004 | -8.466 | 95.747 | 96.185 |
| 83.17218296764597 | 1.942 | -8.107 | 93.187 | 93.604 |
| 83.33023428783935 | 1.884 | -7.748 | 90.732 | 91.129 |
| 83.4975827445147 | 1.835 | -7.401 | 88.443 | 88.821 |
| 83.66493120119004 | 1.799 | -7.086 | 86.352 | 86.715 |
| 83.83227965786537 | 1.766 | -6.813 | 84.442 | 84.79 |
| 83.99962811454073 | 1.73 | -6.58 | 82.668 | 83.004 |
| 84.16697657121607 | 1.693 | -6.39 | 81.026 | 81.351 |
| 84.33432502789142 | 1.647 | -6.228 | 79.535 | 79.852 |
| 84.50167348456677 | 1.591 | -6.082 | 78.204 | 78.513 |
| 84.6690219412421 | 1.538 | -5.946 | 77.03 | 77.332 |
| 84.83637039791745 | 1.494 | -5.819 | 75.998 | 76.291 |
| 85.0037188545928 | 1.465 | -5.706 | 75.105 | 75.392 |
| 85.17106731126813 | 1.444 | -5.598 | 74.358 | 74.638 |
| 85.33841576794349 | 1.423 | -5.491 | 73.77 | 74.042 |
| 85.50576422461883 | 1.403 | -5.395 | 73.329 | 73.594 |
| 85.66381554481221 | 1.388 | -5.315 | 73.018 | 73.28 |
| 85.83116400148755 | 1.38 | -5.255 | 72.835 | 73.094 |
| 85.99851245816289 | 1.376 | -5.209 | 72.782 | 73.037 |
| 86.16586091483823 | 1.376 | -5.172 | 72.874 | 73.127 |
| 86.33320937151358 | 1.387 | -5.141 | 73.131 | 73.384 |
| 86.50055782818893 | 1.408 | -5.109 | 73.566 | 73.818 |
| 86.66790628486427 | 1.435 | -5.076 | 74.172 | 74.424 |
| 86.83525474153961 | 1.46 | -5.038 | 74.923 | 75.177 |
| 87.00260319821496 | 1.488 | -4.987 | 75.776 | 76.029 |
| 87.16995165489031 | 1.521 | -4.911 | 76.687 | 76.939 |
| 87.33730011156564 | 1.562 | -4.804 | 77.631 | 77.88 |
| 87.504648568241 | 1.619 | -4.671 | 78.595 | 78.841 |
| 87.67199702491634 | 1.691 | -4.52 | 79.579 | 79.823 |
| 87.83004834510972 | 1.775 | -4.363 | 80.598 | 80.841 |
| 87.99739680178506 | 1.866 | -4.22 | 81.673 | 81.916 |
| 88.1647452584604 | 1.959 | -4.114 | 82.831 | 83.076 |
| 88.33209371513574 | 2.053 | -4.061 | 84.044 | 84.293 |
| 88.49944217181108 | 2.153 | -4.074 | 85.229 | 85.481 |
| 88.66679062848644 | 2.263 | -4.157 | 86.316 | 86.571 |
| 88.83413908516178 | 2.397 | -4.306 | 87.332 | 87.591 |
| 89.00148754183712 | 2.523 | -4.479 | 88.403 | 88.666 |
| 89.16883599851246 | 2.626 | -4.65 | 89.623 | 89.888 |
| 89.33618445518782 | 2.721 | -4.822 | 91.012 | 91.276 |
| 89.50353291186315 | 2.812 | -4.986 | 92.55 | 92.816 |
| 89.6708813685385 | 2.904 | -5.142 | 94.189 | 94.457 |
| 89.83822982521386 | 3.007 | -5.293 | 95.82 | 96.091 |
| 90.00557828188919 | 3.117 | -5.43 | 97.389 | 97.664 |
| 90.16362960208257 | 3.231 | -5.551 | 98.85 | 99.129 |
| 90.3309780587579 | 3.352 | -5.65 | 100.139 | 100.422 |
| 90.49832651543326 | 3.467 | -5.73 | 101.239 | 101.526 |
| 90.66567497210859 | 3.566 | -5.795 | 102.119 | 102.408 |
| 90.83302342878395 | 3.64 | -5.86 | 102.809 | 103.099 |
| 91.00037188545929 | 3.695 | -5.927 | 103.358 | 103.65 |
| 91.16772034213463 | 3.741 | -5.982 | 103.813 | 104.105 |
| 91.33506879880998 | 3.788 | -6.018 | 104.208 | 104.501 |
| 91.50241725548533 | 3.85 | -6.028 | 104.568 | 104.862 |
| 91.66976571216065 | 3.927 | -6.035 | 104.898 | 105.193 |
| 91.83711416883601 | 4.019 | -6.076 | 105.216 | 105.516 |
| 92.00446262551137 | 4.122 | -6.165 | 105.499 | 105.807 |
| 92.1718110821867 | 4.22 | -6.294 | 105.705 | 106.023 |
| 92.33915953886203 | 4.308 | -6.448 | 105.824 | 106.152 |
| 92.49721085905541 | 4.379 | -6.608 | 105.87 | 106.209 |
| 92.66455931573077 | 4.431 | -6.752 | 105.873 | 106.22 |
| 92.83190777240611 | 4.466 | -6.873 | 105.812 | 106.168 |
| 92.99925622908145 | 4.492 | -6.985 | 105.684 | 106.048 |
| 93.1666046857568 | 4.512 | -7.094 | 105.494 | 105.865 |
| 93.33395314243214 | 4.529 | -7.193 | 105.268 | 105.647 |
| 93.50130159910749 | 4.546 | -7.274 | 105.045 | 105.43 |
| 93.66865005578283 | 4.566 | -7.325 | 104.868 | 105.258 |
| 93.83599851245818 | 4.572 | -7.337 | 104.809 | 105.2 |
| 94.00334696913353 | 4.555 | -7.307 | 104.876 | 105.263 |
| 94.17069542580886 | 4.532 | -7.251 | 104.96 | 105.34 |
| 94.3380438824842 | 4.516 | -7.178 | 104.982 | 105.355 |
| 94.50539233915954 | 4.519 | -7.099 | 105.002 | 105.37 |
| 94.66344365935292 | 4.533 | -7.016 | 105.076 | 105.438 |
| 94.83079211602828 | 4.557 | -6.932 | 105.223 | 105.58 |
| 94.99814057270362 | 4.585 | -6.845 | 105.397 | 105.75 |
| 95.16548902937897 | 4.595 | -6.745 | 105.528 | 105.874 |
| 95.33283748605432 | 4.598 | -6.643 | 105.465 | 105.804 |
| 95.50018594272963 | 4.601 | -6.546 | 105.209 | 105.543 |
| 95.66753439940499 | 4.603 | -6.448 | 104.83 | 105.159 |
| 95.83488285608034 | 4.593 | -6.331 | 104.38 | 104.701 |
| 96.00223131275567 | 4.571 | -6.201 | 103.847 | 104.162 |
| 96.16957976943102 | 4.54 | -6.058 | 103.217 | 103.521 |
| 96.33692822610638 | 4.499 | -5.904 | 102.468 | 102.763 |
| 96.50427668278171 | 4.449 | -5.746 | 101.601 | 101.888 |
| 96.67162513945706 | 4.39 | -5.589 | 100.603 | 100.88 |
| 96.8389735961324 | 4.326 | -5.433 | 99.477 | 99.744 |
| 96.99702491632577 | 4.265 | -5.273 | 98.252 | 98.509 |
| 97.16437337300111 | 4.213 | -5.11 | 96.932 | 97.18 |
| 97.33172182967647 | 4.168 | -4.942 | 95.51 | 95.75 |
| 97.49907028635181 | 4.139 | -4.757 | 93.992 | 94.224 |
| 97.66641874302715 | 4.124 | -4.564 | 92.419 | 92.643 |
| 97.8337671997025 | 4.115 | -4.391 | 90.937 | 91.156 |
| 98.00111565637785 | 4.104 | -4.247 | 89.613 | 89.827 |
| 98.16846411305319 | 4.088 | -4.126 | 88.435 | 88.645 |
| 98.33581256972855 | 4.064 | -4.028 | 87.416 | 87.622 |
| 98.50316102640389 | 4.038 | -3.951 | 86.517 | 86.721 |
| 98.67050948307921 | 4.008 | -3.893 | 85.692 | 85.894 |
| 98.83785793975456 | 3.978 | -3.848 | 84.932 | 85.131 |
| 99.0052063964299 | 3.957 | -3.816 | 84.194 | 84.393 |
| 99.17255485310525 | 3.948 | -3.799 | 83.448 | 83.648 |
| 99.33060617329863 | 3.947 | -3.793 | 82.738 | 82.94 |
| 99.49795462997399 | 3.932 | -3.777 | 82.16 | 82.361 |
| 99.66530308664933 | 3.898 | -3.748 | 81.763 | 81.961 |
| 99.83265154332467 | 3.853 | -3.715 | 81.535 | 81.73 |
| 100.0 | 3.817 | -3.691 | 81.438 | 81.63 |